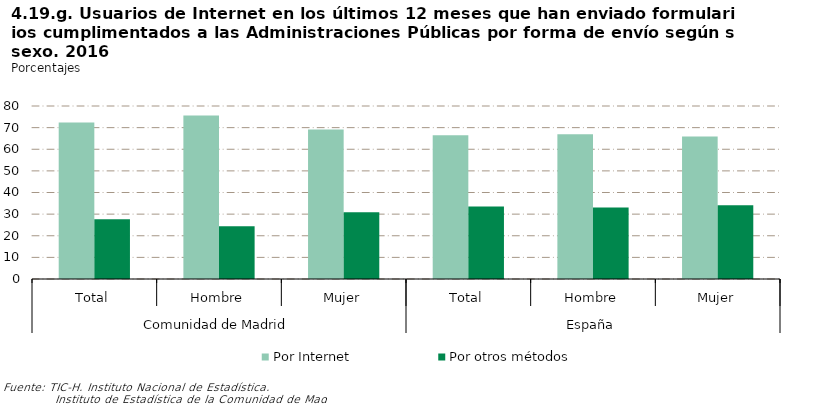
| Category | Por Internet | Por otros métodos |
|---|---|---|
| 0 | 72.407 | 27.593 |
| 1 | 75.588 | 24.412 |
| 2 | 69.095 | 30.905 |
| 3 | 66.43 | 33.57 |
| 4 | 66.914 | 33.086 |
| 5 | 65.893 | 34.107 |